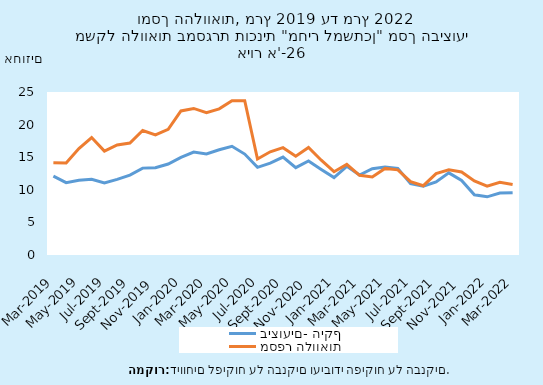
| Category | ביצועים- היקף | מספר הלוואות |
|---|---|---|
| 2019-03-31 | 12.086 | 14.16 |
| 2019-04-30 | 11.095 | 14.109 |
| 2019-05-31 | 11.479 | 16.325 |
| 2019-06-30 | 11.606 | 18.012 |
| 2019-07-31 | 11.039 | 15.941 |
| 2019-08-31 | 11.594 | 16.875 |
| 2019-09-30 | 12.261 | 17.182 |
| 2019-10-31 | 13.326 | 19.101 |
| 2019-11-30 | 13.373 | 18.407 |
| 2019-12-31 | 13.956 | 19.285 |
| 2020-01-31 | 14.972 | 22.095 |
| 2020-02-29 | 15.78 | 22.48 |
| 2020-03-31 | 15.506 | 21.844 |
| 2020-04-30 | 16.139 | 22.415 |
| 2020-05-31 | 16.677 | 23.672 |
| 2020-06-30 | 15.481 | 23.666 |
| 2020-07-31 | 13.449 | 14.727 |
| 2020-08-31 | 14.08 | 15.828 |
| 2020-09-30 | 15.012 | 16.467 |
| 2020-10-31 | 13.4 | 15.161 |
| 2020-11-30 | 14.421 | 16.505 |
| 2020-12-31 | 13.12 | 14.54 |
| 2021-01-31 | 11.873 | 12.776 |
| 2021-02-28 | 13.602 | 13.901 |
| 2021-03-31 | 12.271 | 12.215 |
| 2021-04-30 | 13.24 | 11.982 |
| 2021-05-31 | 13.511 | 13.283 |
| 2021-06-30 | 13.291 | 13.057 |
| 2021-07-31 | 10.936 | 11.257 |
| 2021-08-31 | 10.545 | 10.63 |
| 2021-09-30 | 11.217 | 12.489 |
| 2021-10-31 | 12.593 | 13.078 |
| 2021-11-30 | 11.424 | 12.735 |
| 2021-12-31 | 9.236 | 11.362 |
| 2022-01-31 | 8.921 | 10.543 |
| 2022-02-28 | 9.507 | 11.155 |
| 2022-03-31 | 9.557 | 10.827 |